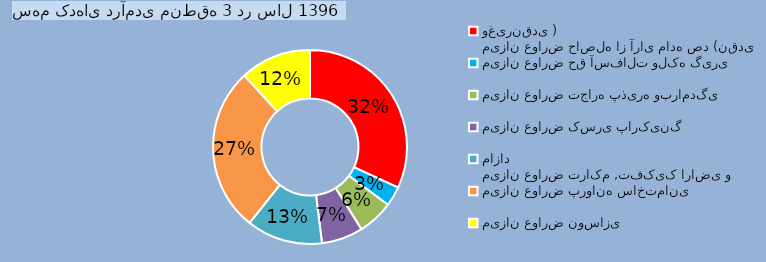
| Category | Series 2 |
|---|---|
| میزان عوارض حاصله از آرای ماده صد (نقدی وغیرنقدی ) | 45221352 |
| میزان عوارض حق آسفالت ولکه گیری | 4675689 |
| میزان عوارض تجاره پذیره وبرامدگی | 8461869 |
| میزان عوارض کسری پارکینگ | 9803266 |
| میزان عوارض تراکم ,تفکیک اراضی و مازاد | 18003913 |
| میزان عوارض پروانه ساختمانی | 38980334 |
| میزان عوارض نوسازی | 16785291 |